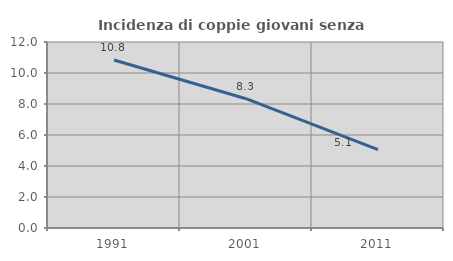
| Category | Incidenza di coppie giovani senza figli |
|---|---|
| 1991.0 | 10.841 |
| 2001.0 | 8.343 |
| 2011.0 | 5.062 |